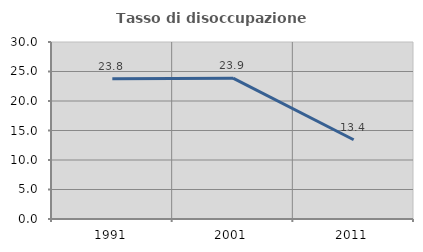
| Category | Tasso di disoccupazione giovanile  |
|---|---|
| 1991.0 | 23.784 |
| 2001.0 | 23.864 |
| 2011.0 | 13.433 |